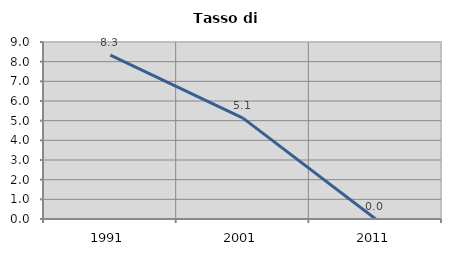
| Category | Tasso di disoccupazione   |
|---|---|
| 1991.0 | 8.333 |
| 2001.0 | 5.128 |
| 2011.0 | 0 |